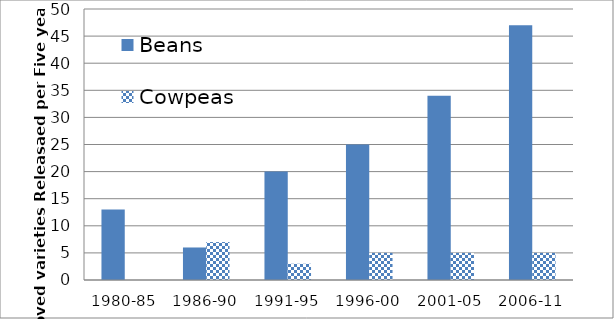
| Category | Beans | Cowpeas |
|---|---|---|
| 1980-85 | 13 | 0 |
| 1986-90 | 6 | 7 |
| 1991-95 | 20 | 3 |
| 1996-00 | 25 | 5 |
| 2001-05 | 34 | 5 |
| 2006-11 | 47 | 5 |